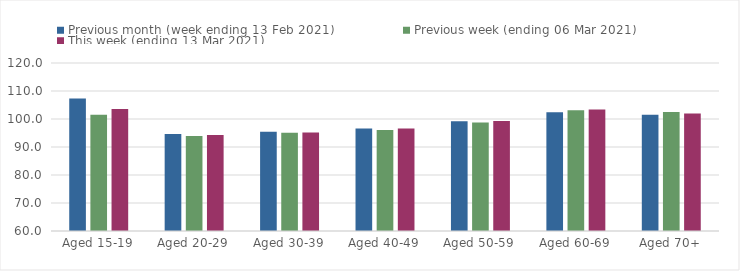
| Category | Previous month (week ending 13 Feb 2021) | Previous week (ending 06 Mar 2021) | This week (ending 13 Mar 2021) |
|---|---|---|---|
| Aged 15-19 | 107.29 | 101.52 | 103.61 |
| Aged 20-29 | 94.6 | 93.89 | 94.27 |
| Aged 30-39 | 95.45 | 95.05 | 95.2 |
| Aged 40-49 | 96.65 | 96.1 | 96.58 |
| Aged 50-59 | 99.19 | 98.79 | 99.26 |
| Aged 60-69 | 102.37 | 103.09 | 103.42 |
| Aged 70+ | 101.52 | 102.49 | 102 |